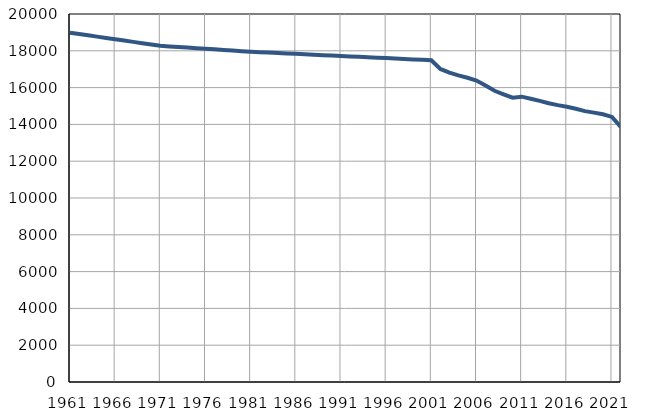
| Category | Population
size |
|---|---|
| 1961.0 | 18985 |
| 1962.0 | 18914 |
| 1963.0 | 18842 |
| 1964.0 | 18771 |
| 1965.0 | 18699 |
| 1966.0 | 18628 |
| 1967.0 | 18556 |
| 1968.0 | 18485 |
| 1969.0 | 18413 |
| 1970.0 | 18342 |
| 1971.0 | 18270 |
| 1972.0 | 18238 |
| 1973.0 | 18207 |
| 1974.0 | 18174 |
| 1975.0 | 18142 |
| 1976.0 | 18110 |
| 1977.0 | 18078 |
| 1978.0 | 18046 |
| 1979.0 | 18013 |
| 1980.0 | 17982 |
| 1981.0 | 17950 |
| 1982.0 | 17927 |
| 1983.0 | 17903 |
| 1984.0 | 17880 |
| 1985.0 | 17856 |
| 1986.0 | 17833 |
| 1987.0 | 17810 |
| 1988.0 | 17786 |
| 1989.0 | 17762 |
| 1990.0 | 17739 |
| 1991.0 | 17716 |
| 1992.0 | 17694 |
| 1993.0 | 17670 |
| 1994.0 | 17648 |
| 1995.0 | 17625 |
| 1996.0 | 17603 |
| 1997.0 | 17579 |
| 1998.0 | 17556 |
| 1999.0 | 17533 |
| 2000.0 | 17511 |
| 2001.0 | 17488 |
| 2002.0 | 17012 |
| 2003.0 | 16815 |
| 2004.0 | 16662 |
| 2005.0 | 16533 |
| 2006.0 | 16380 |
| 2007.0 | 16119 |
| 2008.0 | 15828 |
| 2009.0 | 15637 |
| 2010.0 | 15454 |
| 2011.0 | 15507 |
| 2012.0 | 15398 |
| 2013.0 | 15281 |
| 2014.0 | 15150 |
| 2015.0 | 15046 |
| 2016.0 | 14962 |
| 2017.0 | 14851 |
| 2018.0 | 14721 |
| 2019.0 | 14639 |
| 2020.0 | 14553 |
| 2021.0 | 14407 |
| 2022.0 | 13846 |